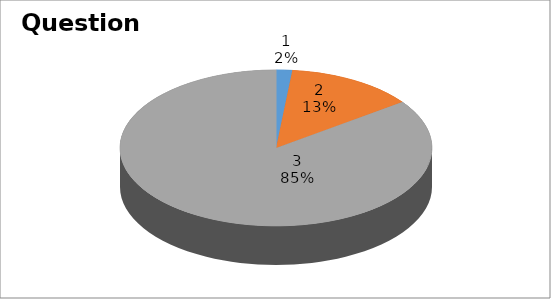
| Category | Series 0 |
|---|---|
| 0 | 1 |
| 1 | 8 |
| 2 | 51 |